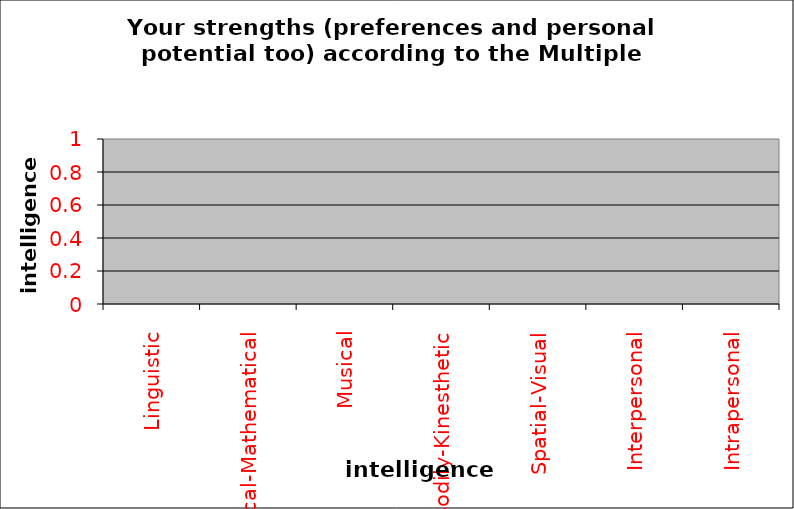
| Category | Series 0 |
|---|---|
| Linguistic | 0 |
| Logical-Mathematical | 0 |
| Musical | 0 |
| Bodily-Kinesthetic | 0 |
| Spatial-Visual | 0 |
| Interpersonal | 0 |
| Intrapersonal | 0 |